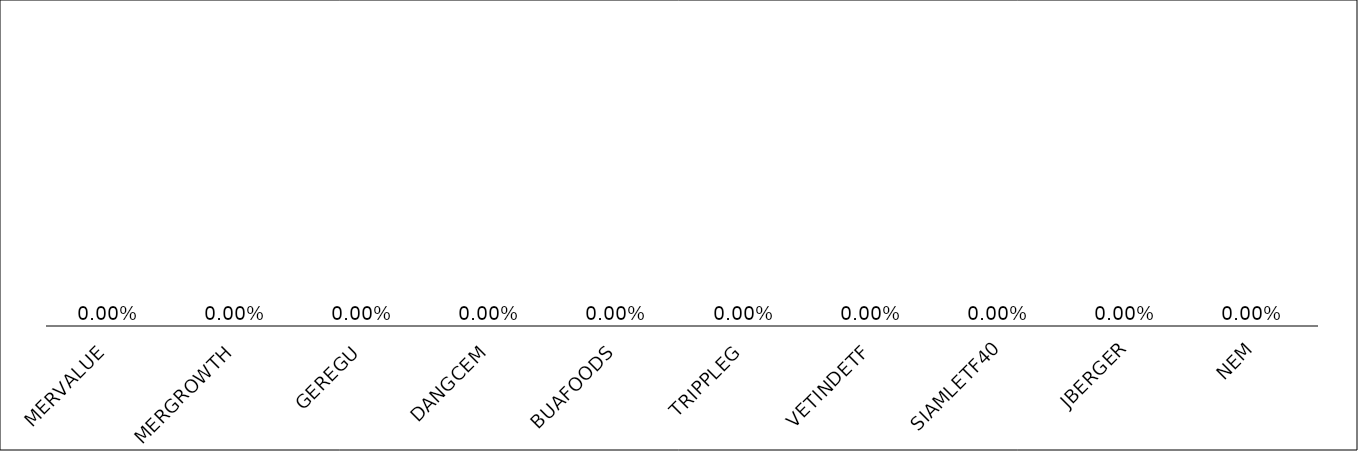
| Category | Series 0 |
|---|---|
| MERVALUE | 9.549 |
| MERGROWTH | 9.297 |
| GEREGU | 1.506 |
| DANGCEM | 1.053 |
| BUAFOODS | 0.964 |
| TRIPPLEG | 0.921 |
| VETINDETF | 0.811 |
| SIAMLETF40 | 0.7 |
| JBERGER | 0.684 |
| NEM | 0.643 |